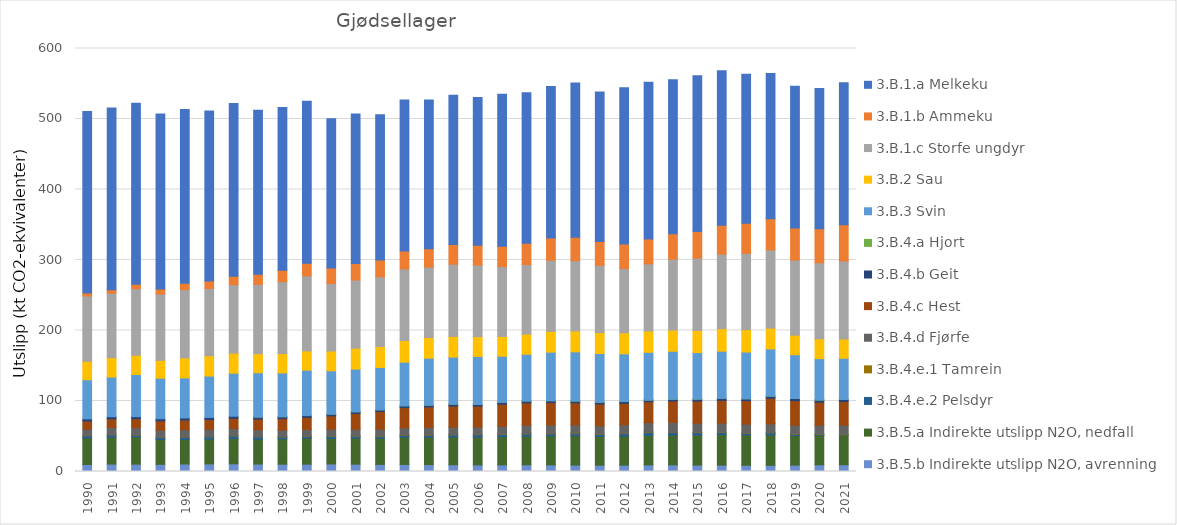
| Category | 3.B.5.b Indirekte utslipp N2O, avrenning | 3.B.5.a Indirekte utslipp N2O, nedfall | 3.B.4.e.2 Pelsdyr | 3.B.4.e.1 Tamrein | 3.B.4.d Fjørfe | 3.B.4.c Hest | 3.B.4.b Geit | 3.B.4.a Hjort | 3.B.3 Svin | 3.B.2 Sau | 3.B.1.c Storfe ungdyr | 3.B.1.b Ammeku | 3.B.1.a Melkeku |
|---|---|---|---|---|---|---|---|---|---|---|---|---|---|
| 1990.0 | 9.915 | 37.693 | 3.096 | 0.574 | 8.677 | 11.55 | 3.179 | 0 | 55.483 | 26.212 | 92.578 | 4.268 | 257.414 |
| 1991.0 | 10.541 | 38.182 | 3.272 | 0.535 | 9.932 | 12.122 | 3.167 | 0 | 56.31 | 27.341 | 91.622 | 4.95 | 257.51 |
| 1992.0 | 10.435 | 38.642 | 2.525 | 0.534 | 9.999 | 12.621 | 3.099 | 0 | 59.729 | 27.342 | 94.342 | 6.224 | 256.804 |
| 1993.0 | 10.137 | 35.319 | 2.813 | 0.516 | 9.787 | 13.208 | 3.066 | 0 | 57.434 | 25.33 | 94.091 | 7.208 | 248.279 |
| 1994.0 | 10.619 | 34.954 | 3.251 | 0.516 | 9.926 | 13.734 | 3.007 | 0 | 56.858 | 28.303 | 96.779 | 9.028 | 246.513 |
| 1995.0 | 10.773 | 35.012 | 3.373 | 0.502 | 10.064 | 13.969 | 2.955 | 0 | 58.75 | 28.764 | 95.499 | 10.592 | 240.959 |
| 1996.0 | 10.948 | 35.751 | 3.79 | 0.472 | 10.007 | 14.472 | 2.986 | 0 | 61.01 | 28.363 | 97.153 | 12.078 | 245.093 |
| 1997.0 | 10.57 | 35.145 | 3.516 | 0.477 | 9.538 | 15.144 | 2.865 | 0.011 | 62.83 | 27.027 | 98.262 | 14.297 | 232.674 |
| 1998.0 | 10.362 | 35.955 | 2.815 | 0.444 | 9.182 | 16.233 | 2.706 | 0.01 | 62.098 | 27.425 | 102.099 | 16.091 | 230.862 |
| 1999.0 | 10.406 | 37.182 | 2.352 | 0.445 | 9.276 | 17.088 | 2.603 | 0.023 | 64.391 | 27.381 | 106.205 | 18.152 | 229.617 |
| 2000.0 | 10.762 | 36.258 | 2.818 | 0.408 | 9.823 | 18.799 | 2.53 | 0.03 | 61.435 | 28.002 | 95.701 | 22.047 | 211.644 |
| 2001.0 | 10.406 | 36.955 | 2.854 | 0.398 | 9.346 | 22.248 | 2.526 | 0.025 | 60.428 | 29.762 | 96.586 | 23.577 | 212.138 |
| 2002.0 | 10.065 | 37.12 | 2.764 | 0.454 | 9.714 | 25.017 | 2.349 | 0.036 | 60.069 | 29.715 | 98.867 | 23.805 | 206.009 |
| 2003.0 | 9.983 | 38.782 | 2.721 | 0.497 | 9.962 | 28.661 | 2.595 | 0.032 | 61.857 | 30.74 | 101.508 | 25.258 | 214.261 |
| 2004.0 | 9.848 | 38.787 | 2.928 | 0.551 | 10.568 | 28.888 | 2.519 | 0.036 | 66.568 | 29.347 | 99.809 | 26.007 | 210.925 |
| 2005.0 | 9.596 | 39.309 | 3.099 | 0.555 | 10.299 | 29.893 | 2.737 | 0.056 | 66.673 | 29.316 | 102.505 | 27.961 | 211.719 |
| 2006.0 | 9.321 | 39.512 | 3.381 | 0.552 | 10.286 | 29.644 | 2.484 | 0.069 | 67.954 | 28.122 | 101.382 | 28.195 | 209.442 |
| 2007.0 | 9.405 | 39.809 | 3.349 | 0.576 | 11.044 | 31.322 | 2.612 | 0.064 | 65.296 | 28.152 | 98.907 | 28.964 | 215.752 |
| 2008.0 | 9.491 | 40.608 | 3.103 | 0.6 | 11.839 | 31.658 | 2.765 | 0.078 | 66.159 | 28.623 | 98.522 | 30.186 | 213.563 |
| 2009.0 | 9.351 | 41.319 | 2.786 | 0.588 | 11.948 | 31.714 | 2.68 | 0.091 | 68.812 | 29.519 | 100.836 | 31.716 | 214.724 |
| 2010.0 | 9.149 | 41.586 | 2.864 | 0.602 | 11.793 | 31.341 | 2.63 | 0.097 | 69.665 | 29.707 | 99.54 | 33.203 | 218.898 |
| 2011.0 | 8.904 | 40.725 | 3.096 | 0.594 | 11.539 | 30.848 | 2.487 | 0.104 | 69.023 | 29.768 | 95.299 | 33.773 | 212.15 |
| 2012.0 | 9.016 | 41.167 | 3.538 | 0.611 | 12.099 | 30.225 | 2.577 | 0.111 | 67.574 | 29.826 | 91.266 | 34.589 | 221.57 |
| 2013.0 | 9.36 | 41.999 | 4.258 | 0.587 | 13.108 | 29.585 | 2.449 | 0.104 | 67.61 | 30.238 | 95.292 | 35.174 | 222.267 |
| 2014.0 | 9.38 | 42.215 | 4.101 | 0.551 | 13.424 | 30.269 | 2.478 | 0.103 | 68.044 | 30.024 | 100.585 | 36.088 | 218.434 |
| 2015.0 | 9.079 | 42.565 | 3.689 | 0.502 | 12.754 | 31.354 | 2.632 | 0.099 | 66.011 | 31.294 | 102.645 | 37.643 | 221.076 |
| 2016.0 | 9.021 | 43.194 | 3.177 | 0.501 | 12.793 | 32.211 | 2.729 | 0.104 | 66.894 | 31.88 | 105.911 | 40.766 | 219.298 |
| 2017.0 | 8.774 | 43.095 | 2.318 | 0.506 | 12.587 | 33.127 | 2.69 | 0.094 | 66.269 | 31.724 | 108.281 | 42.526 | 211.336 |
| 2018.0 | 8.758 | 43.168 | 3.01 | 0.504 | 12.225 | 36.215 | 2.978 | 0.106 | 66.92 | 29.443 | 110.987 | 44.317 | 205.74 |
| 2019.0 | 9.027 | 41.903 | 1.965 | 0.509 | 12.261 | 34.808 | 3.078 | 0.108 | 62.076 | 27.679 | 106.512 | 45.334 | 201.202 |
| 2020.0 | 9.534 | 41.894 | 1.129 | 0.506 | 12.467 | 32.786 | 3.033 | 0.111 | 58.641 | 28.194 | 107.706 | 48.422 | 198.735 |
| 2021.0 | 9.608 | 42.497 | 0.152 | 0.504 | 12.92 | 33.462 | 3.038 | 0.111 | 58.336 | 27.328 | 110.583 | 51.422 | 201.323 |